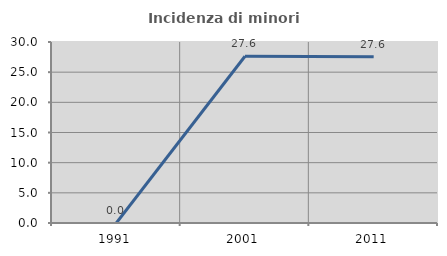
| Category | Incidenza di minori stranieri |
|---|---|
| 1991.0 | 0 |
| 2001.0 | 27.632 |
| 2011.0 | 27.57 |